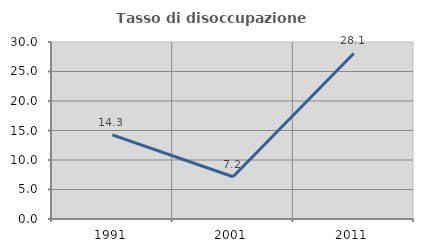
| Category | Tasso di disoccupazione giovanile  |
|---|---|
| 1991.0 | 14.258 |
| 2001.0 | 7.166 |
| 2011.0 | 28.053 |